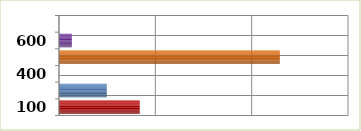
| Category | Series 0 |
|---|---|
| 100.0 | 83769690 |
| 200.0 | 49605625 |
| 400.0 | 0 |
| 500.0 | 229224220 |
| 600.0 | 13308021 |
| 700.0 | 0 |